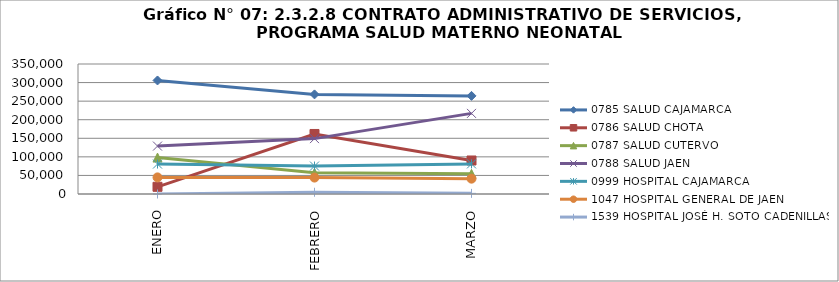
| Category | 0785 SALUD CAJAMARCA | 0786 SALUD CHOTA | 0787 SALUD CUTERVO | 0788 SALUD JAEN | 0999 HOSPITAL CAJAMARCA | 1047 HOSPITAL GENERAL DE JAEN | 1539 HOSPITAL JOSÉ H. SOTO CADENILLAS |
|---|---|---|---|---|---|---|---|
| ENERO | 305661 | 19359 | 98062 | 128989 | 80602 | 44718 | 0 |
| FEBRERO | 268152 | 161605 | 57073 | 149094 | 75255 | 44190 | 4704 |
| MARZO | 264160 | 90205 | 54222 | 217050 | 81028 | 41290 | 1704 |